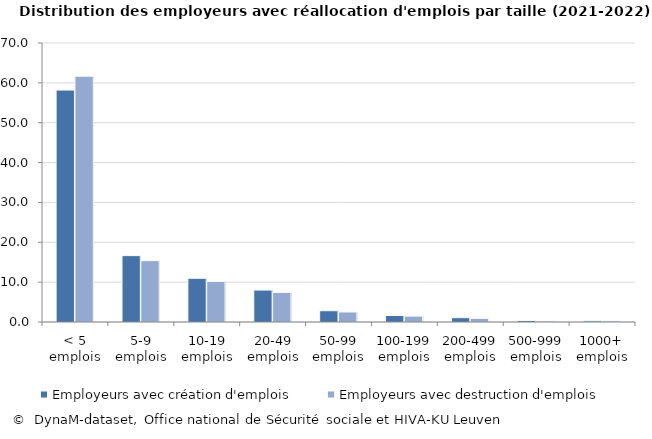
| Category | Employeurs avec création d'emplois | Employeurs avec destruction d'emplois |
|---|---|---|
| < 5 emplois | 58.188 | 61.675 |
| 5-9 emplois | 16.651 | 15.39 |
| 10-19 emplois | 10.967 | 10.167 |
| 20-49 emplois | 8.019 | 7.393 |
| 50-99 emplois | 2.827 | 2.51 |
| 100-199 emplois | 1.623 | 1.473 |
| 200-499 emplois | 1.081 | 0.885 |
| 500-999 emplois | 0.368 | 0.248 |
| 1000+ emplois | 0.277 | 0.259 |